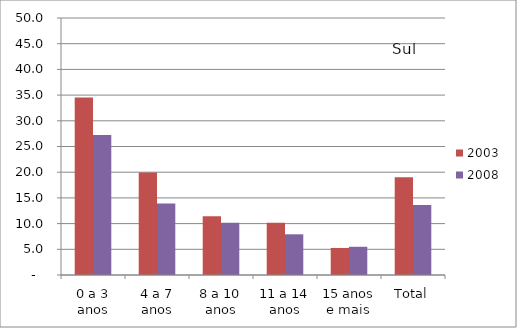
| Category | 2003 | 2008 |
|---|---|---|
| 0 a 3 anos | 34.55 | 27.23 |
| 4 a 7 anos | 19.93 | 13.93 |
| 8 a 10 anos | 11.43 | 10.16 |
| 11 a 14 anos | 10.15 | 7.92 |
| 15 anos e mais | 5.26 | 5.49 |
| Total | 19.03 | 13.64 |